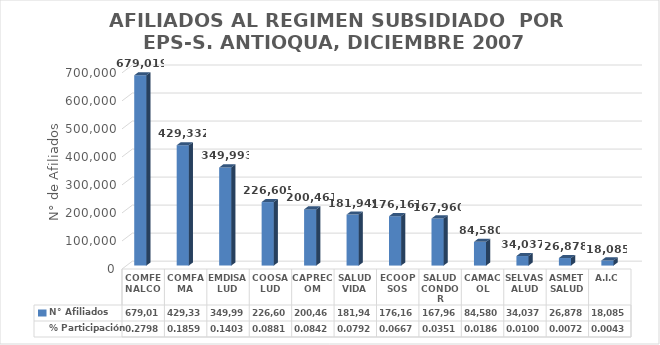
| Category | N° Afiliados | % Participación |
|---|---|---|
| COMFENALCO | 679019 | 0.28 |
| COMFAMA | 429332 | 0.186 |
| EMDISALUD | 349993 | 0.14 |
| COOSALUD | 226605 | 0.088 |
| CAPRECOM | 200461 | 0.084 |
| SALUD VIDA | 181949 | 0.079 |
| ECOOPSOS | 176161 | 0.067 |
| SALUD CONDOR | 167960 | 0.035 |
| CAMACOL | 84580 | 0.019 |
| SELVASALUD | 34037 | 0.01 |
| ASMETSALUD | 26878 | 0.007 |
| A.I.C | 18085 | 0.004 |